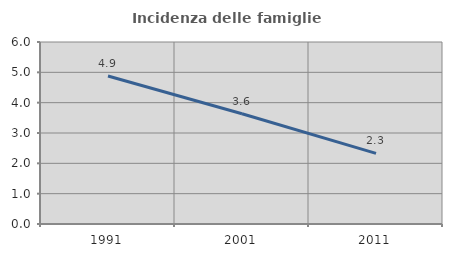
| Category | Incidenza delle famiglie numerose |
|---|---|
| 1991.0 | 4.878 |
| 2001.0 | 3.636 |
| 2011.0 | 2.328 |